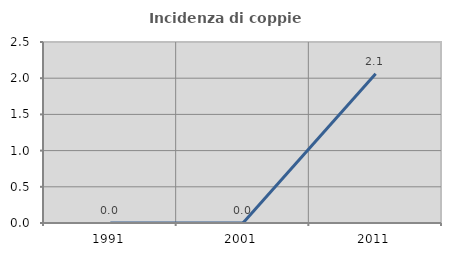
| Category | Incidenza di coppie miste |
|---|---|
| 1991.0 | 0 |
| 2001.0 | 0 |
| 2011.0 | 2.062 |